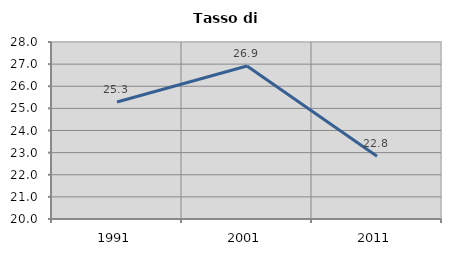
| Category | Tasso di disoccupazione   |
|---|---|
| 1991.0 | 25.286 |
| 2001.0 | 26.913 |
| 2011.0 | 22.837 |